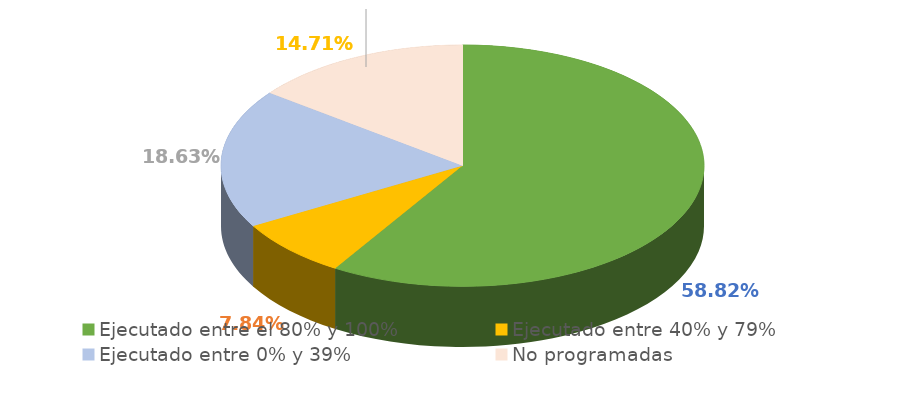
| Category | Series 0 |
|---|---|
| Ejecutado entre el 80% y 100% | 0.588 |
| Ejecutado entre 40% y 79% | 0.078 |
| Ejecutado entre 0% y 39% | 0.186 |
| No programadas | 0.147 |